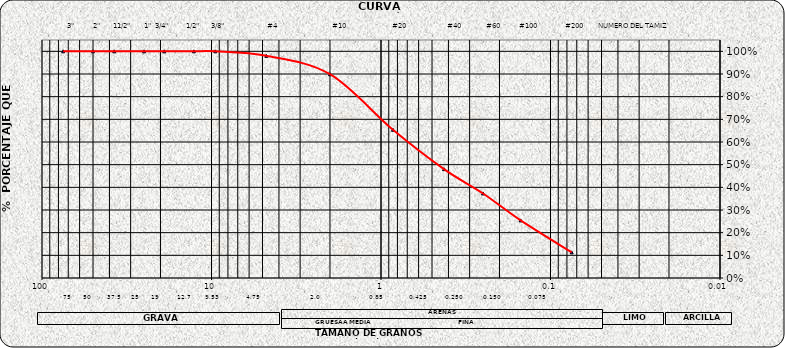
| Category | Series 0 |
|---|---|
| 75.0 | 1 |
| 50.0 | 1 |
| 37.5 | 1 |
| 25.0 | 1 |
| 19.0 | 1 |
| 12.7 | 1 |
| 9.5 | 1 |
| 4.75 | 0.98 |
| 2.0 | 0.899 |
| 0.85 | 0.654 |
| 0.425 | 0.48 |
| 0.25 | 0.373 |
| 0.15 | 0.254 |
| 0.075 | 0.113 |
| nan | 0 |